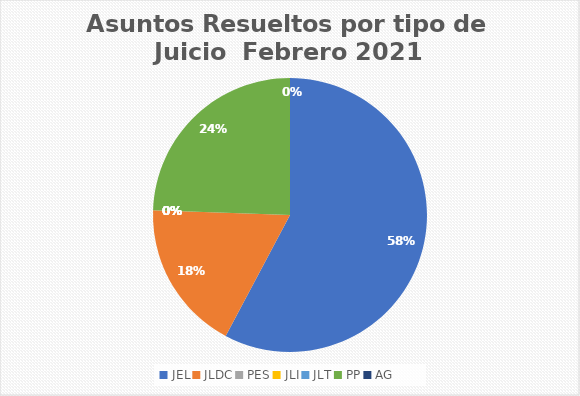
| Category | Asuntos Resueltos por tipo de Juicio  Febrero |
|---|---|
| JEL | 26 |
| JLDC | 8 |
| PES | 0 |
| JLI | 0 |
| JLT | 0 |
| PP | 11 |
| AG | 0 |